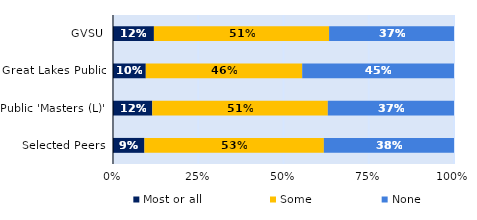
| Category | Most or all | Some | None |
|---|---|---|---|
| GVSU | 0.12 | 0.514 | 0.366 |
| Great Lakes Public | 0.096 | 0.459 | 0.445 |
| Public 'Masters (L)' | 0.115 | 0.515 | 0.37 |
| Selected Peers | 0.092 | 0.526 | 0.382 |